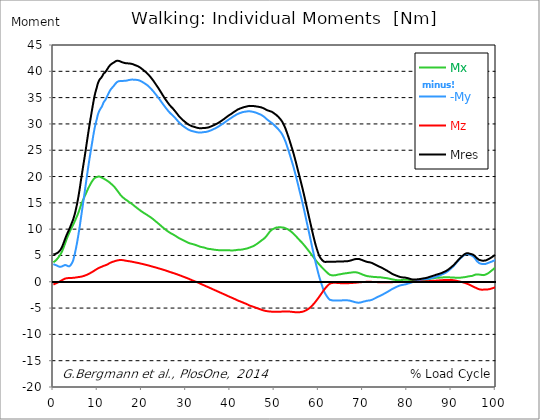
| Category |  Mx |  -My |  Mz |  Mres |
|---|---|---|---|---|
| 0.0 | 3.7 | 3.37 | -0.53 | 5.21 |
| 0.1646090534979424 | 3.8 | 3.3 | -0.46 | 5.23 |
| 0.3292181069958848 | 3.9 | 3.23 | -0.39 | 5.25 |
| 0.5041152263374485 | 4.02 | 3.19 | -0.33 | 5.3 |
| 0.668724279835391 | 4.16 | 3.13 | -0.27 | 5.37 |
| 0.8333333333333333 | 4.31 | 3.05 | -0.2 | 5.44 |
| 0.9979423868312757 | 4.47 | 2.98 | -0.13 | 5.53 |
| 1.162551440329218 | 4.66 | 2.91 | -0.06 | 5.64 |
| 1.337448559670782 | 4.85 | 2.87 | 0.01 | 5.78 |
| 1.5020576131687242 | 5.04 | 2.85 | 0.08 | 5.93 |
| 1.6666666666666665 | 5.28 | 2.86 | 0.17 | 6.15 |
| 1.831275720164609 | 5.55 | 2.91 | 0.25 | 6.41 |
| 1.9958847736625513 | 5.84 | 2.93 | 0.32 | 6.69 |
| 2.170781893004115 | 6.19 | 3.01 | 0.41 | 7.04 |
| 2.3353909465020575 | 6.55 | 3.09 | 0.48 | 7.41 |
| 2.4999999999999996 | 6.93 | 3.16 | 0.55 | 7.79 |
| 2.6646090534979425 | 7.32 | 3.19 | 0.61 | 8.17 |
| 2.829218106995885 | 7.71 | 3.18 | 0.65 | 8.54 |
| 3.0041152263374484 | 8.1 | 3.11 | 0.67 | 8.89 |
| 3.168724279835391 | 8.46 | 3.03 | 0.68 | 9.2 |
| 3.333333333333333 | 8.79 | 2.97 | 0.7 | 9.5 |
| 3.497942386831276 | 9.12 | 2.93 | 0.71 | 9.81 |
| 3.662551440329218 | 9.45 | 2.96 | 0.72 | 10.13 |
| 3.837448559670782 | 9.76 | 3.09 | 0.73 | 10.48 |
| 4.002057613168724 | 10.05 | 3.27 | 0.73 | 10.83 |
| 4.166666666666667 | 10.33 | 3.49 | 0.74 | 11.17 |
| 4.3312757201646095 | 10.6 | 3.76 | 0.74 | 11.52 |
| 4.495884773662552 | 10.87 | 4.12 | 0.74 | 11.9 |
| 4.670781893004115 | 11.18 | 4.68 | 0.76 | 12.38 |
| 4.835390946502058 | 11.48 | 5.24 | 0.78 | 12.85 |
| 4.999999999999999 | 11.8 | 5.9 | 0.8 | 13.42 |
| 5.164609053497943 | 12.13 | 6.59 | 0.82 | 14.04 |
| 5.329218106995885 | 12.45 | 7.31 | 0.85 | 14.69 |
| 5.504115226337448 | 12.8 | 8.12 | 0.87 | 15.42 |
| 5.668724279835391 | 13.15 | 8.95 | 0.89 | 16.19 |
| 5.833333333333333 | 13.55 | 9.83 | 0.91 | 17.03 |
| 5.997942386831276 | 13.95 | 10.73 | 0.93 | 17.91 |
| 6.162551440329218 | 14.38 | 11.73 | 0.95 | 18.89 |
| 6.337448559670782 | 14.76 | 12.7 | 0.98 | 19.8 |
| 6.502057613168724 | 15.12 | 13.66 | 1.01 | 20.7 |
| 6.666666666666666 | 15.46 | 14.62 | 1.05 | 21.6 |
| 6.831275720164609 | 15.79 | 15.58 | 1.1 | 22.47 |
| 6.995884773662552 | 16.1 | 16.53 | 1.14 | 23.35 |
| 7.170781893004115 | 16.41 | 17.55 | 1.2 | 24.25 |
| 7.3353909465020575 | 16.71 | 18.57 | 1.25 | 25.16 |
| 7.500000000000001 | 17.03 | 19.56 | 1.31 | 26.11 |
| 7.664609053497942 | 17.35 | 20.55 | 1.36 | 27.06 |
| 7.829218106995885 | 17.66 | 21.5 | 1.42 | 27.99 |
| 8.004115226337449 | 17.94 | 22.45 | 1.49 | 28.9 |
| 8.168724279835391 | 18.22 | 23.37 | 1.56 | 29.79 |
| 8.333333333333334 | 18.48 | 24.23 | 1.65 | 30.63 |
| 8.497942386831278 | 18.74 | 25.09 | 1.73 | 31.46 |
| 8.662551440329219 | 18.98 | 25.95 | 1.81 | 32.3 |
| 8.837448559670783 | 19.2 | 26.8 | 1.89 | 33.11 |
| 9.002057613168725 | 19.39 | 27.66 | 1.97 | 33.92 |
| 9.166666666666668 | 19.57 | 28.48 | 2.06 | 34.69 |
| 9.33127572016461 | 19.7 | 29.21 | 2.15 | 35.38 |
| 9.495884773662551 | 19.81 | 29.87 | 2.25 | 35.99 |
| 9.670781893004117 | 19.86 | 30.43 | 2.33 | 36.49 |
| 9.83539094650206 | 19.9 | 30.95 | 2.42 | 36.96 |
| 9.999999999999998 | 19.98 | 31.58 | 2.5 | 37.53 |
| 10.16460905349794 | 20.01 | 32.02 | 2.58 | 37.93 |
| 10.329218106995887 | 20.01 | 32.37 | 2.65 | 38.23 |
| 10.504115226337447 | 19.98 | 32.68 | 2.71 | 38.48 |
| 10.66872427983539 | 19.91 | 32.9 | 2.77 | 38.65 |
| 10.833333333333334 | 19.83 | 33.11 | 2.82 | 38.8 |
| 10.997942386831275 | 19.75 | 33.36 | 2.88 | 38.98 |
| 11.162551440329217 | 19.69 | 33.68 | 2.94 | 39.23 |
| 11.337448559670783 | 19.65 | 34.06 | 3.01 | 39.54 |
| 11.502057613168724 | 19.55 | 34.26 | 3.06 | 39.68 |
| 11.666666666666666 | 19.45 | 34.44 | 3.1 | 39.78 |
| 11.831275720164609 | 19.38 | 34.66 | 3.15 | 39.94 |
| 11.995884773662551 | 19.3 | 34.94 | 3.21 | 40.14 |
| 12.170781893004115 | 19.21 | 35.26 | 3.29 | 40.38 |
| 12.335390946502057 | 19.11 | 35.53 | 3.35 | 40.57 |
| 12.5 | 19.02 | 35.86 | 3.44 | 40.82 |
| 12.664609053497943 | 18.9 | 36.13 | 3.52 | 41 |
| 12.829218106995885 | 18.79 | 36.38 | 3.6 | 41.18 |
| 13.004115226337449 | 18.65 | 36.59 | 3.66 | 41.31 |
| 13.168724279835391 | 18.54 | 36.76 | 3.72 | 41.41 |
| 13.333333333333332 | 18.42 | 36.92 | 3.77 | 41.5 |
| 13.497942386831276 | 18.29 | 37.07 | 3.81 | 41.59 |
| 13.662551440329217 | 18.15 | 37.23 | 3.86 | 41.67 |
| 13.837448559670783 | 17.99 | 37.41 | 3.9 | 41.77 |
| 14.002057613168724 | 17.81 | 37.61 | 3.95 | 41.87 |
| 14.166666666666666 | 17.64 | 37.79 | 3.99 | 41.96 |
| 14.33127572016461 | 17.45 | 37.91 | 4.03 | 42 |
| 14.495884773662551 | 17.27 | 38.01 | 4.07 | 42.01 |
| 14.670781893004115 | 17.08 | 38.09 | 4.09 | 42.01 |
| 14.835390946502057 | 16.9 | 38.12 | 4.11 | 41.97 |
| 15.000000000000002 | 16.71 | 38.14 | 4.13 | 41.91 |
| 15.164609053497943 | 16.51 | 38.16 | 4.14 | 41.86 |
| 15.329218106995883 | 16.35 | 38.16 | 4.14 | 41.79 |
| 15.504115226337449 | 16.2 | 38.17 | 4.13 | 41.74 |
| 15.66872427983539 | 16.07 | 38.17 | 4.11 | 41.69 |
| 15.833333333333334 | 15.96 | 38.18 | 4.09 | 41.65 |
| 15.997942386831276 | 15.84 | 38.19 | 4.07 | 41.62 |
| 16.162551440329217 | 15.73 | 38.19 | 4.04 | 41.57 |
| 16.337448559670783 | 15.64 | 38.2 | 4.01 | 41.55 |
| 16.502057613168724 | 15.54 | 38.22 | 3.99 | 41.53 |
| 16.666666666666668 | 15.44 | 38.25 | 3.96 | 41.52 |
| 16.83127572016461 | 15.34 | 38.29 | 3.94 | 41.51 |
| 16.995884773662556 | 15.23 | 38.33 | 3.92 | 41.5 |
| 17.170781893004115 | 15.12 | 38.36 | 3.9 | 41.49 |
| 17.33539094650206 | 15.04 | 38.38 | 3.88 | 41.47 |
| 17.500000000000004 | 14.96 | 38.4 | 3.85 | 41.45 |
| 17.66460905349794 | 14.86 | 38.42 | 3.83 | 41.43 |
| 17.82921810699589 | 14.75 | 38.43 | 3.8 | 41.39 |
| 18.00411522633745 | 14.64 | 38.42 | 3.77 | 41.34 |
| 18.16872427983539 | 14.52 | 38.41 | 3.74 | 41.28 |
| 18.333333333333336 | 14.41 | 38.39 | 3.71 | 41.22 |
| 18.497942386831276 | 14.29 | 38.38 | 3.68 | 41.16 |
| 18.66255144032922 | 14.18 | 38.38 | 3.66 | 41.11 |
| 18.837448559670786 | 14.08 | 38.37 | 3.63 | 41.07 |
| 19.002057613168724 | 13.97 | 38.36 | 3.6 | 41.02 |
| 19.166666666666668 | 13.85 | 38.33 | 3.57 | 40.94 |
| 19.331275720164612 | 13.75 | 38.29 | 3.54 | 40.86 |
| 19.495884773662553 | 13.65 | 38.24 | 3.51 | 40.78 |
| 19.67078189300412 | 13.54 | 38.18 | 3.47 | 40.68 |
| 19.83539094650206 | 13.43 | 38.11 | 3.44 | 40.58 |
| 19.999999999999996 | 13.33 | 38.03 | 3.41 | 40.47 |
| 20.164609053497944 | 13.24 | 37.95 | 3.37 | 40.36 |
| 20.32921810699588 | 13.14 | 37.87 | 3.34 | 40.25 |
| 20.504115226337447 | 13.06 | 37.77 | 3.3 | 40.12 |
| 20.66872427983539 | 12.97 | 37.68 | 3.27 | 40.01 |
| 20.833333333333332 | 12.89 | 37.59 | 3.24 | 39.9 |
| 20.997942386831276 | 12.8 | 37.51 | 3.21 | 39.79 |
| 21.162551440329217 | 12.71 | 37.4 | 3.17 | 39.65 |
| 21.33744855967078 | 12.62 | 37.29 | 3.13 | 39.51 |
| 21.502057613168724 | 12.52 | 37.17 | 3.1 | 39.37 |
| 21.666666666666668 | 12.43 | 37.04 | 3.06 | 39.21 |
| 21.83127572016461 | 12.34 | 36.89 | 3.02 | 39.04 |
| 21.99588477366255 | 12.25 | 36.74 | 2.98 | 38.87 |
| 22.170781893004115 | 12.15 | 36.6 | 2.94 | 38.7 |
| 22.335390946502056 | 12.05 | 36.45 | 2.9 | 38.52 |
| 22.5 | 11.94 | 36.3 | 2.86 | 38.34 |
| 22.664609053497944 | 11.82 | 36.13 | 2.82 | 38.14 |
| 22.82921810699588 | 11.7 | 35.96 | 2.79 | 37.94 |
| 23.004115226337447 | 11.58 | 35.77 | 2.75 | 37.73 |
| 23.16872427983539 | 11.46 | 35.6 | 2.71 | 37.52 |
| 23.333333333333332 | 11.34 | 35.42 | 2.67 | 37.31 |
| 23.497942386831276 | 11.24 | 35.25 | 2.62 | 37.12 |
| 23.662551440329217 | 11.12 | 35.07 | 2.58 | 36.9 |
| 23.83744855967078 | 11 | 34.88 | 2.54 | 36.69 |
| 24.002057613168727 | 10.88 | 34.69 | 2.5 | 36.46 |
| 24.166666666666664 | 10.76 | 34.49 | 2.46 | 36.24 |
| 24.33127572016461 | 10.63 | 34.3 | 2.42 | 36.01 |
| 24.495884773662553 | 10.51 | 34.1 | 2.38 | 35.79 |
| 24.670781893004115 | 10.39 | 33.9 | 2.33 | 35.56 |
| 24.83539094650206 | 10.27 | 33.7 | 2.29 | 35.33 |
| 25.0 | 10.15 | 33.51 | 2.25 | 35.11 |
| 25.164609053497944 | 10.04 | 33.33 | 2.2 | 34.9 |
| 25.329218106995885 | 9.93 | 33.14 | 2.16 | 34.69 |
| 25.504115226337447 | 9.82 | 32.96 | 2.11 | 34.48 |
| 25.66872427983539 | 9.71 | 32.78 | 2.06 | 34.28 |
| 25.833333333333332 | 9.61 | 32.61 | 2.01 | 34.09 |
| 25.997942386831276 | 9.51 | 32.45 | 1.97 | 33.9 |
| 26.16255144032922 | 9.42 | 32.28 | 1.92 | 33.71 |
| 26.337448559670783 | 9.33 | 32.12 | 1.87 | 33.53 |
| 26.502057613168724 | 9.25 | 31.99 | 1.83 | 33.38 |
| 26.666666666666664 | 9.17 | 31.86 | 1.78 | 33.23 |
| 26.83127572016461 | 9.1 | 31.73 | 1.74 | 33.09 |
| 26.995884773662553 | 9.02 | 31.61 | 1.69 | 32.95 |
| 27.170781893004115 | 8.94 | 31.46 | 1.64 | 32.78 |
| 27.33539094650206 | 8.86 | 31.31 | 1.6 | 32.61 |
| 27.499999999999996 | 8.78 | 31.17 | 1.55 | 32.45 |
| 27.66460905349794 | 8.69 | 31.01 | 1.5 | 32.27 |
| 27.829218106995885 | 8.6 | 30.85 | 1.46 | 32.09 |
| 28.004115226337447 | 8.51 | 30.69 | 1.41 | 31.91 |
| 28.16872427983539 | 8.42 | 30.52 | 1.35 | 31.72 |
| 28.333333333333332 | 8.33 | 30.36 | 1.3 | 31.54 |
| 28.49794238683128 | 8.25 | 30.22 | 1.25 | 31.38 |
| 28.66255144032922 | 8.18 | 30.08 | 1.2 | 31.23 |
| 28.837448559670783 | 8.11 | 29.95 | 1.14 | 31.09 |
| 29.002057613168724 | 8.04 | 29.83 | 1.09 | 30.95 |
| 29.166666666666664 | 7.98 | 29.71 | 1.04 | 30.82 |
| 29.331275720164612 | 7.91 | 29.61 | 0.98 | 30.69 |
| 29.495884773662553 | 7.84 | 29.5 | 0.93 | 30.57 |
| 29.670781893004115 | 7.77 | 29.4 | 0.88 | 30.45 |
| 29.835390946502056 | 7.7 | 29.3 | 0.83 | 30.34 |
| 30.000000000000004 | 7.63 | 29.2 | 0.77 | 30.23 |
| 30.164609053497944 | 7.55 | 29.11 | 0.72 | 30.12 |
| 30.329218106995885 | 7.48 | 29.02 | 0.66 | 30.01 |
| 30.504115226337447 | 7.41 | 28.94 | 0.61 | 29.91 |
| 30.66872427983539 | 7.36 | 28.87 | 0.55 | 29.83 |
| 30.833333333333336 | 7.31 | 28.8 | 0.48 | 29.76 |
| 30.99794238683128 | 7.27 | 28.74 | 0.42 | 29.69 |
| 31.162551440329217 | 7.23 | 28.69 | 0.36 | 29.63 |
| 31.33744855967078 | 7.19 | 28.64 | 0.3 | 29.57 |
| 31.50205761316873 | 7.16 | 28.61 | 0.24 | 29.53 |
| 31.666666666666668 | 7.12 | 28.58 | 0.18 | 29.49 |
| 31.831275720164612 | 7.08 | 28.55 | 0.13 | 29.45 |
| 31.995884773662553 | 7.04 | 28.51 | 0.07 | 29.4 |
| 32.17078189300411 | 6.99 | 28.48 | 0.02 | 29.36 |
| 32.33539094650206 | 6.94 | 28.44 | -0.02 | 29.31 |
| 32.5 | 6.89 | 28.41 | -0.08 | 29.27 |
| 32.66460905349794 | 6.83 | 28.39 | -0.14 | 29.24 |
| 32.82921810699589 | 6.78 | 28.37 | -0.2 | 29.21 |
| 33.00411522633745 | 6.72 | 28.36 | -0.26 | 29.19 |
| 33.168724279835395 | 6.67 | 28.35 | -0.33 | 29.16 |
| 33.333333333333336 | 6.64 | 28.34 | -0.4 | 29.16 |
| 33.49794238683128 | 6.6 | 28.36 | -0.46 | 29.17 |
| 33.66255144032922 | 6.58 | 28.4 | -0.53 | 29.2 |
| 33.83744855967078 | 6.55 | 28.43 | -0.59 | 29.22 |
| 34.00205761316873 | 6.51 | 28.44 | -0.65 | 29.23 |
| 34.16666666666667 | 6.48 | 28.45 | -0.72 | 29.23 |
| 34.331275720164605 | 6.43 | 28.46 | -0.78 | 29.24 |
| 34.49588477366255 | 6.39 | 28.48 | -0.84 | 29.24 |
| 34.67078189300412 | 6.33 | 28.52 | -0.9 | 29.27 |
| 34.83539094650206 | 6.29 | 28.55 | -0.95 | 29.3 |
| 35.00000000000001 | 6.26 | 28.58 | -1.02 | 29.32 |
| 35.16460905349794 | 6.24 | 28.63 | -1.08 | 29.37 |
| 35.32921810699588 | 6.23 | 28.68 | -1.15 | 29.42 |
| 35.504115226337454 | 6.22 | 28.74 | -1.21 | 29.47 |
| 35.668724279835395 | 6.19 | 28.79 | -1.27 | 29.53 |
| 35.833333333333336 | 6.17 | 28.85 | -1.33 | 29.58 |
| 35.99794238683128 | 6.15 | 28.92 | -1.4 | 29.65 |
| 36.16255144032922 | 6.13 | 28.99 | -1.47 | 29.71 |
| 36.33744855967078 | 6.11 | 29.05 | -1.53 | 29.77 |
| 36.50205761316873 | 6.08 | 29.12 | -1.59 | 29.84 |
| 36.66666666666667 | 6.06 | 29.19 | -1.65 | 29.91 |
| 36.831275720164605 | 6.05 | 29.26 | -1.71 | 29.98 |
| 36.99588477366255 | 6.03 | 29.33 | -1.78 | 30.05 |
| 37.17078189300412 | 6.02 | 29.42 | -1.84 | 30.13 |
| 37.33539094650206 | 6.01 | 29.5 | -1.9 | 30.22 |
| 37.5 | 6 | 29.59 | -1.97 | 30.31 |
| 37.66460905349794 | 5.98 | 29.68 | -2.03 | 30.4 |
| 37.82921810699589 | 5.97 | 29.78 | -2.09 | 30.5 |
| 38.00411522633745 | 5.96 | 29.87 | -2.15 | 30.59 |
| 38.168724279835395 | 5.97 | 29.96 | -2.22 | 30.68 |
| 38.333333333333336 | 5.97 | 30.05 | -2.28 | 30.78 |
| 38.49794238683127 | 5.97 | 30.15 | -2.34 | 30.88 |
| 38.662551440329224 | 5.97 | 30.25 | -2.4 | 30.98 |
| 38.83744855967078 | 5.97 | 30.35 | -2.47 | 31.09 |
| 39.00205761316872 | 5.97 | 30.45 | -2.53 | 31.2 |
| 39.16666666666667 | 5.98 | 30.55 | -2.59 | 31.3 |
| 39.331275720164605 | 5.98 | 30.65 | -2.66 | 31.41 |
| 39.49588477366255 | 5.98 | 30.75 | -2.73 | 31.51 |
| 39.67078189300412 | 5.98 | 30.85 | -2.79 | 31.62 |
| 39.83539094650206 | 5.98 | 30.94 | -2.86 | 31.71 |
| 39.99999999999999 | 5.96 | 31.02 | -2.91 | 31.79 |
| 40.16460905349794 | 5.95 | 31.11 | -2.97 | 31.87 |
| 40.32921810699589 | 5.95 | 31.2 | -3.03 | 31.97 |
| 40.50411522633745 | 5.96 | 31.3 | -3.09 | 32.07 |
| 40.668724279835395 | 5.96 | 31.4 | -3.15 | 32.18 |
| 40.83333333333333 | 5.97 | 31.49 | -3.22 | 32.28 |
| 40.99794238683128 | 5.99 | 31.57 | -3.28 | 32.36 |
| 41.16255144032922 | 6 | 31.65 | -3.35 | 32.45 |
| 41.33744855967078 | 6.02 | 31.73 | -3.42 | 32.54 |
| 41.50205761316872 | 6.04 | 31.82 | -3.49 | 32.64 |
| 41.666666666666664 | 6.06 | 31.89 | -3.55 | 32.73 |
| 41.83127572016461 | 6.09 | 31.95 | -3.6 | 32.79 |
| 41.99588477366255 | 6.11 | 32 | -3.66 | 32.85 |
| 42.17078189300412 | 6.1 | 32.06 | -3.71 | 32.92 |
| 42.33539094650206 | 6.1 | 32.12 | -3.76 | 32.97 |
| 42.5 | 6.11 | 32.15 | -3.82 | 33.02 |
| 42.66460905349794 | 6.12 | 32.19 | -3.88 | 33.06 |
| 42.82921810699589 | 6.15 | 32.25 | -3.93 | 33.12 |
| 43.00411522633745 | 6.19 | 32.27 | -3.99 | 33.17 |
| 43.16872427983539 | 6.23 | 32.3 | -4.05 | 33.2 |
| 43.333333333333336 | 6.25 | 32.32 | -4.11 | 33.24 |
| 43.49794238683128 | 6.27 | 32.34 | -4.16 | 33.27 |
| 43.66255144032922 | 6.3 | 32.36 | -4.22 | 33.3 |
| 43.83744855967078 | 6.34 | 32.38 | -4.28 | 33.33 |
| 44.00205761316873 | 6.39 | 32.4 | -4.35 | 33.37 |
| 44.166666666666664 | 6.44 | 32.42 | -4.43 | 33.41 |
| 44.33127572016461 | 6.49 | 32.42 | -4.5 | 33.43 |
| 44.49588477366255 | 6.54 | 32.39 | -4.55 | 33.42 |
| 44.67078189300411 | 6.59 | 32.36 | -4.6 | 33.41 |
| 44.835390946502066 | 6.65 | 32.35 | -4.64 | 33.41 |
| 45.0 | 6.7 | 32.32 | -4.69 | 33.4 |
| 45.16460905349794 | 6.76 | 32.29 | -4.74 | 33.4 |
| 45.32921810699589 | 6.83 | 32.26 | -4.79 | 33.39 |
| 45.504115226337454 | 6.91 | 32.22 | -4.84 | 33.37 |
| 45.668724279835395 | 7 | 32.17 | -4.89 | 33.35 |
| 45.83333333333333 | 7.09 | 32.13 | -4.95 | 33.33 |
| 45.99794238683128 | 7.18 | 32.08 | -5 | 33.31 |
| 46.16255144032922 | 7.28 | 32.02 | -5.05 | 33.29 |
| 46.33744855967078 | 7.38 | 31.97 | -5.1 | 33.26 |
| 46.50205761316873 | 7.49 | 31.9 | -5.15 | 33.23 |
| 46.666666666666664 | 7.6 | 31.84 | -5.2 | 33.21 |
| 46.831275720164605 | 7.69 | 31.79 | -5.25 | 33.18 |
| 46.99588477366255 | 7.8 | 31.72 | -5.3 | 33.15 |
| 47.17078189300412 | 7.93 | 31.63 | -5.34 | 33.1 |
| 47.33539094650206 | 8.02 | 31.54 | -5.39 | 33.04 |
| 47.5 | 8.11 | 31.45 | -5.43 | 32.98 |
| 47.66460905349794 | 8.23 | 31.34 | -5.48 | 32.91 |
| 47.82921810699588 | 8.36 | 31.22 | -5.52 | 32.84 |
| 48.004115226337454 | 8.51 | 31.1 | -5.55 | 32.76 |
| 48.168724279835395 | 8.68 | 30.96 | -5.57 | 32.67 |
| 48.33333333333333 | 8.86 | 30.83 | -5.59 | 32.6 |
| 48.49794238683128 | 9.04 | 30.73 | -5.61 | 32.56 |
| 48.66255144032922 | 9.23 | 30.63 | -5.63 | 32.52 |
| 48.83744855967078 | 9.41 | 30.52 | -5.65 | 32.47 |
| 49.00205761316873 | 9.57 | 30.41 | -5.66 | 32.42 |
| 49.166666666666664 | 9.73 | 30.31 | -5.67 | 32.37 |
| 49.331275720164605 | 9.86 | 30.22 | -5.68 | 32.33 |
| 49.49588477366255 | 9.96 | 30.11 | -5.69 | 32.26 |
| 49.67078189300412 | 10.03 | 29.99 | -5.7 | 32.17 |
| 49.83539094650206 | 10.08 | 29.86 | -5.7 | 32.06 |
| 50.0 | 10.15 | 29.71 | -5.7 | 31.95 |
| 50.16460905349794 | 10.23 | 29.58 | -5.71 | 31.86 |
| 50.32921810699589 | 10.29 | 29.45 | -5.72 | 31.76 |
| 50.504115226337454 | 10.32 | 29.31 | -5.72 | 31.63 |
| 50.668724279835395 | 10.33 | 29.17 | -5.71 | 31.5 |
| 50.83333333333333 | 10.34 | 29.02 | -5.71 | 31.37 |
| 50.99794238683128 | 10.34 | 28.86 | -5.7 | 31.22 |
| 51.162551440329224 | 10.35 | 28.68 | -5.7 | 31.06 |
| 51.33744855967078 | 10.35 | 28.51 | -5.69 | 30.9 |
| 51.50205761316873 | 10.34 | 28.33 | -5.68 | 30.73 |
| 51.666666666666664 | 10.34 | 28.11 | -5.67 | 30.53 |
| 51.83127572016461 | 10.33 | 27.86 | -5.66 | 30.29 |
| 51.99588477366255 | 10.3 | 27.58 | -5.65 | 30.02 |
| 52.17078189300412 | 10.27 | 27.28 | -5.65 | 29.73 |
| 52.335390946502066 | 10.22 | 26.96 | -5.64 | 29.43 |
| 52.5 | 10.17 | 26.61 | -5.64 | 29.08 |
| 52.66460905349795 | 10.11 | 26.21 | -5.64 | 28.7 |
| 52.82921810699588 | 10.04 | 25.8 | -5.65 | 28.31 |
| 53.00411522633745 | 9.98 | 25.38 | -5.65 | 27.9 |
| 53.1687242798354 | 9.9 | 24.95 | -5.66 | 27.49 |
| 53.33333333333333 | 9.81 | 24.51 | -5.66 | 27.06 |
| 53.49794238683128 | 9.71 | 24.05 | -5.68 | 26.61 |
| 53.66255144032922 | 9.6 | 23.59 | -5.69 | 26.16 |
| 53.83744855967078 | 9.48 | 23.12 | -5.71 | 25.7 |
| 54.00205761316873 | 9.37 | 22.67 | -5.72 | 25.25 |
| 54.166666666666664 | 9.24 | 22.19 | -5.74 | 24.78 |
| 54.33127572016461 | 9.11 | 21.7 | -5.75 | 24.3 |
| 54.495884773662546 | 8.96 | 21.18 | -5.76 | 23.79 |
| 54.67078189300412 | 8.82 | 20.65 | -5.78 | 23.26 |
| 54.835390946502066 | 8.67 | 20.11 | -5.79 | 22.74 |
| 54.99999999999999 | 8.52 | 19.56 | -5.79 | 22.19 |
| 55.16460905349795 | 8.37 | 18.99 | -5.8 | 21.64 |
| 55.32921810699588 | 8.21 | 18.43 | -5.8 | 21.08 |
| 55.50411522633745 | 8.06 | 17.86 | -5.79 | 20.53 |
| 55.668724279835395 | 7.91 | 17.29 | -5.78 | 19.98 |
| 55.83333333333333 | 7.76 | 16.72 | -5.76 | 19.42 |
| 55.99794238683128 | 7.63 | 16.16 | -5.75 | 18.88 |
| 56.162551440329224 | 7.48 | 15.57 | -5.72 | 18.32 |
| 56.33744855967078 | 7.32 | 14.97 | -5.69 | 17.74 |
| 56.50205761316873 | 7.16 | 14.37 | -5.65 | 17.15 |
| 56.666666666666664 | 7 | 13.76 | -5.61 | 16.56 |
| 56.83127572016461 | 6.83 | 13.13 | -5.55 | 15.95 |
| 56.99588477366256 | 6.66 | 12.48 | -5.48 | 15.32 |
| 57.17078189300412 | 6.48 | 11.83 | -5.41 | 14.69 |
| 57.335390946502066 | 6.3 | 11.19 | -5.33 | 14.07 |
| 57.49999999999999 | 6.12 | 10.54 | -5.25 | 13.44 |
| 57.66460905349794 | 5.94 | 9.89 | -5.16 | 12.81 |
| 57.829218106995896 | 5.76 | 9.25 | -5.06 | 12.19 |
| 58.00411522633745 | 5.58 | 8.6 | -4.94 | 11.58 |
| 58.168724279835395 | 5.39 | 7.96 | -4.81 | 10.97 |
| 58.33333333333333 | 5.2 | 7.31 | -4.68 | 10.35 |
| 58.49794238683128 | 5.02 | 6.66 | -4.53 | 9.74 |
| 58.662551440329224 | 4.83 | 6.02 | -4.39 | 9.13 |
| 58.83744855967078 | 4.64 | 5.38 | -4.24 | 8.53 |
| 59.00205761316873 | 4.46 | 4.74 | -4.08 | 7.96 |
| 59.16666666666666 | 4.27 | 4.12 | -3.9 | 7.41 |
| 59.33127572016461 | 4.08 | 3.53 | -3.73 | 6.9 |
| 59.49588477366256 | 3.9 | 2.96 | -3.54 | 6.43 |
| 59.67078189300411 | 3.73 | 2.4 | -3.36 | 5.98 |
| 59.835390946502066 | 3.56 | 1.85 | -3.17 | 5.56 |
| 60.00000000000001 | 3.4 | 1.31 | -2.98 | 5.17 |
| 60.16460905349794 | 3.24 | 0.81 | -2.79 | 4.83 |
| 60.32921810699589 | 3.09 | 0.35 | -2.59 | 4.6 |
| 60.50411522633745 | 2.94 | -0.1 | -2.38 | 4.4 |
| 60.66872427983539 | 2.79 | -0.53 | -2.18 | 4.23 |
| 60.833333333333336 | 2.64 | -0.95 | -1.97 | 4.07 |
| 60.99794238683128 | 2.5 | -1.35 | -1.77 | 3.93 |
| 61.162551440329224 | 2.36 | -1.72 | -1.58 | 3.83 |
| 61.33744855967078 | 2.22 | -2.04 | -1.39 | 3.78 |
| 61.50205761316872 | 2.08 | -2.3 | -1.21 | 3.77 |
| 61.66666666666667 | 1.95 | -2.53 | -1.05 | 3.78 |
| 61.831275720164605 | 1.81 | -2.73 | -0.9 | 3.79 |
| 61.99588477366256 | 1.68 | -2.94 | -0.75 | 3.79 |
| 62.17078189300411 | 1.54 | -3.14 | -0.61 | 3.79 |
| 62.33539094650205 | 1.43 | -3.29 | -0.48 | 3.79 |
| 62.50000000000001 | 1.34 | -3.41 | -0.37 | 3.81 |
| 62.66460905349794 | 1.3 | -3.44 | -0.31 | 3.8 |
| 62.82921810699589 | 1.26 | -3.49 | -0.27 | 3.81 |
| 63.00411522633746 | 1.23 | -3.53 | -0.23 | 3.82 |
| 63.16872427983539 | 1.21 | -3.55 | -0.21 | 3.82 |
| 63.333333333333336 | 1.21 | -3.57 | -0.2 | 3.82 |
| 63.49794238683128 | 1.22 | -3.56 | -0.2 | 3.81 |
| 63.662551440329224 | 1.23 | -3.56 | -0.19 | 3.81 |
| 63.83744855967079 | 1.25 | -3.56 | -0.19 | 3.82 |
| 64.00205761316873 | 1.29 | -3.56 | -0.21 | 3.83 |
| 64.16666666666667 | 1.33 | -3.56 | -0.22 | 3.84 |
| 64.3312757201646 | 1.37 | -3.56 | -0.24 | 3.85 |
| 64.49588477366255 | 1.39 | -3.55 | -0.25 | 3.85 |
| 64.67078189300412 | 1.41 | -3.54 | -0.25 | 3.85 |
| 64.83539094650206 | 1.42 | -3.54 | -0.26 | 3.85 |
| 65.0 | 1.45 | -3.54 | -0.27 | 3.85 |
| 65.16460905349794 | 1.48 | -3.54 | -0.28 | 3.86 |
| 65.32921810699588 | 1.51 | -3.53 | -0.29 | 3.87 |
| 65.50411522633745 | 1.54 | -3.53 | -0.29 | 3.87 |
| 65.66872427983539 | 1.56 | -3.53 | -0.29 | 3.88 |
| 65.83333333333334 | 1.58 | -3.52 | -0.29 | 3.88 |
| 65.99794238683127 | 1.61 | -3.52 | -0.29 | 3.89 |
| 66.16255144032922 | 1.62 | -3.52 | -0.29 | 3.9 |
| 66.33744855967079 | 1.64 | -3.53 | -0.29 | 3.91 |
| 66.50205761316873 | 1.65 | -3.53 | -0.28 | 3.91 |
| 66.66666666666667 | 1.67 | -3.54 | -0.27 | 3.93 |
| 66.8312757201646 | 1.7 | -3.56 | -0.27 | 3.96 |
| 66.99588477366255 | 1.71 | -3.59 | -0.25 | 3.99 |
| 67.17078189300412 | 1.73 | -3.62 | -0.24 | 4.03 |
| 67.33539094650206 | 1.75 | -3.66 | -0.23 | 4.07 |
| 67.5 | 1.77 | -3.7 | -0.22 | 4.12 |
| 67.66460905349794 | 1.79 | -3.74 | -0.22 | 4.16 |
| 67.8292181069959 | 1.81 | -3.78 | -0.21 | 4.21 |
| 68.00411522633746 | 1.82 | -3.82 | -0.2 | 4.25 |
| 68.16872427983539 | 1.82 | -3.87 | -0.19 | 4.29 |
| 68.33333333333334 | 1.81 | -3.89 | -0.18 | 4.31 |
| 68.49794238683127 | 1.79 | -3.92 | -0.16 | 4.33 |
| 68.66255144032921 | 1.76 | -3.96 | -0.15 | 4.35 |
| 68.83744855967078 | 1.73 | -3.97 | -0.14 | 4.35 |
| 69.00205761316872 | 1.68 | -3.98 | -0.12 | 4.34 |
| 69.16666666666667 | 1.63 | -3.97 | -0.11 | 4.32 |
| 69.33127572016461 | 1.58 | -3.95 | -0.09 | 4.27 |
| 69.49588477366255 | 1.52 | -3.92 | -0.08 | 4.22 |
| 69.67078189300412 | 1.46 | -3.89 | -0.07 | 4.17 |
| 69.83539094650206 | 1.4 | -3.85 | -0.07 | 4.12 |
| 70.00000000000001 | 1.34 | -3.8 | -0.06 | 4.05 |
| 70.16460905349794 | 1.29 | -3.76 | -0.05 | 4 |
| 70.32921810699588 | 1.23 | -3.74 | -0.04 | 3.95 |
| 70.50411522633745 | 1.19 | -3.7 | -0.03 | 3.9 |
| 70.66872427983539 | 1.14 | -3.66 | -0.02 | 3.85 |
| 70.83333333333333 | 1.1 | -3.62 | -0.02 | 3.8 |
| 70.99794238683128 | 1.07 | -3.6 | -0.01 | 3.77 |
| 71.16255144032922 | 1.05 | -3.58 | -0.01 | 3.74 |
| 71.33744855967079 | 1.03 | -3.57 | 0 | 3.72 |
| 71.50205761316873 | 1.01 | -3.55 | 0 | 3.7 |
| 71.66666666666667 | 1 | -3.51 | -0.01 | 3.66 |
| 71.83127572016461 | 0.98 | -3.48 | -0.01 | 3.63 |
| 71.99588477366255 | 0.96 | -3.44 | -0.02 | 3.58 |
| 72.17078189300412 | 0.94 | -3.38 | -0.02 | 3.52 |
| 72.33539094650205 | 0.93 | -3.31 | -0.03 | 3.45 |
| 72.5 | 0.92 | -3.24 | -0.04 | 3.38 |
| 72.66460905349795 | 0.91 | -3.18 | -0.04 | 3.31 |
| 72.82921810699588 | 0.9 | -3.1 | -0.05 | 3.24 |
| 73.00411522633746 | 0.89 | -3.02 | -0.06 | 3.16 |
| 73.1687242798354 | 0.88 | -2.95 | -0.06 | 3.09 |
| 73.33333333333334 | 0.88 | -2.88 | -0.07 | 3.02 |
| 73.49794238683127 | 0.88 | -2.81 | -0.07 | 2.95 |
| 73.66255144032921 | 0.87 | -2.75 | -0.08 | 2.89 |
| 73.83744855967078 | 0.86 | -2.69 | -0.08 | 2.83 |
| 74.00205761316873 | 0.85 | -2.62 | -0.08 | 2.77 |
| 74.16666666666667 | 0.83 | -2.55 | -0.08 | 2.7 |
| 74.33127572016461 | 0.81 | -2.48 | -0.09 | 2.62 |
| 74.49588477366255 | 0.78 | -2.41 | -0.09 | 2.55 |
| 74.67078189300412 | 0.76 | -2.33 | -0.09 | 2.47 |
| 74.83539094650207 | 0.74 | -2.25 | -0.09 | 2.39 |
| 75.0 | 0.72 | -2.17 | -0.09 | 2.31 |
| 75.16460905349794 | 0.71 | -2.1 | -0.09 | 2.24 |
| 75.32921810699588 | 0.69 | -2.02 | -0.09 | 2.16 |
| 75.50411522633745 | 0.67 | -1.94 | -0.09 | 2.08 |
| 75.6687242798354 | 0.64 | -1.85 | -0.09 | 1.99 |
| 75.83333333333333 | 0.61 | -1.77 | -0.09 | 1.9 |
| 75.99794238683128 | 0.58 | -1.69 | -0.08 | 1.82 |
| 76.16255144032922 | 0.55 | -1.61 | -0.08 | 1.74 |
| 76.33744855967079 | 0.52 | -1.52 | -0.08 | 1.65 |
| 76.50205761316873 | 0.48 | -1.43 | -0.07 | 1.56 |
| 76.66666666666667 | 0.45 | -1.35 | -0.07 | 1.48 |
| 76.83127572016461 | 0.42 | -1.28 | -0.07 | 1.41 |
| 76.99588477366254 | 0.4 | -1.21 | -0.06 | 1.35 |
| 77.17078189300412 | 0.37 | -1.14 | -0.06 | 1.3 |
| 77.33539094650206 | 0.35 | -1.07 | -0.06 | 1.24 |
| 77.5 | 0.33 | -1.01 | -0.05 | 1.19 |
| 77.66460905349794 | 0.31 | -0.95 | -0.05 | 1.14 |
| 77.82921810699588 | 0.29 | -0.88 | -0.05 | 1.08 |
| 78.00411522633745 | 0.29 | -0.82 | -0.06 | 1.02 |
| 78.1687242798354 | 0.29 | -0.77 | -0.06 | 0.97 |
| 78.33333333333334 | 0.29 | -0.72 | -0.06 | 0.93 |
| 78.49794238683127 | 0.3 | -0.68 | -0.06 | 0.89 |
| 78.66255144032921 | 0.32 | -0.64 | -0.06 | 0.86 |
| 78.83744855967078 | 0.34 | -0.61 | -0.05 | 0.84 |
| 79.00205761316873 | 0.36 | -0.58 | -0.05 | 0.83 |
| 79.16666666666667 | 0.37 | -0.56 | -0.05 | 0.82 |
| 79.33127572016461 | 0.38 | -0.54 | -0.05 | 0.81 |
| 79.49588477366257 | 0.38 | -0.51 | -0.04 | 0.8 |
| 79.67078189300412 | 0.39 | -0.48 | -0.04 | 0.78 |
| 79.83539094650207 | 0.39 | -0.44 | -0.04 | 0.74 |
| 79.99999999999999 | 0.39 | -0.39 | -0.03 | 0.71 |
| 80.16460905349794 | 0.38 | -0.35 | -0.03 | 0.68 |
| 80.32921810699588 | 0.36 | -0.31 | -0.03 | 0.63 |
| 80.50411522633745 | 0.33 | -0.27 | -0.02 | 0.59 |
| 80.66872427983539 | 0.3 | -0.22 | -0.02 | 0.54 |
| 80.83333333333333 | 0.27 | -0.18 | -0.01 | 0.5 |
| 80.99794238683128 | 0.24 | -0.14 | -0.01 | 0.47 |
| 81.16255144032922 | 0.21 | -0.09 | -0.01 | 0.45 |
| 81.33744855967079 | 0.18 | -0.04 | 0 | 0.44 |
| 81.50205761316873 | 0.15 | 0.01 | 0 | 0.43 |
| 81.66666666666666 | 0.11 | 0.05 | 0 | 0.43 |
| 81.83127572016461 | 0.09 | 0.09 | 0 | 0.42 |
| 81.99588477366255 | 0.06 | 0.13 | 0.01 | 0.44 |
| 82.1707818930041 | 0.05 | 0.16 | 0.01 | 0.45 |
| 82.33539094650206 | 0.05 | 0.18 | 0.01 | 0.46 |
| 82.5 | 0.06 | 0.21 | 0.01 | 0.47 |
| 82.66460905349794 | 0.06 | 0.25 | 0.01 | 0.48 |
| 82.8292181069959 | 0.07 | 0.28 | 0.02 | 0.51 |
| 83.00411522633745 | 0.09 | 0.31 | 0.03 | 0.53 |
| 83.1687242798354 | 0.11 | 0.34 | 0.03 | 0.56 |
| 83.33333333333333 | 0.13 | 0.37 | 0.04 | 0.59 |
| 83.49794238683127 | 0.15 | 0.4 | 0.05 | 0.61 |
| 83.66255144032922 | 0.18 | 0.43 | 0.05 | 0.63 |
| 83.83744855967078 | 0.21 | 0.45 | 0.06 | 0.66 |
| 84.00205761316873 | 0.25 | 0.47 | 0.07 | 0.68 |
| 84.16666666666667 | 0.28 | 0.49 | 0.08 | 0.7 |
| 84.33127572016461 | 0.32 | 0.5 | 0.08 | 0.73 |
| 84.49588477366257 | 0.36 | 0.53 | 0.1 | 0.77 |
| 84.67078189300412 | 0.41 | 0.55 | 0.11 | 0.8 |
| 84.83539094650206 | 0.46 | 0.58 | 0.12 | 0.86 |
| 85.0 | 0.5 | 0.6 | 0.13 | 0.9 |
| 85.16460905349794 | 0.54 | 0.63 | 0.14 | 0.95 |
| 85.32921810699588 | 0.58 | 0.66 | 0.15 | 0.99 |
| 85.50411522633745 | 0.61 | 0.7 | 0.16 | 1.04 |
| 85.66872427983539 | 0.63 | 0.74 | 0.17 | 1.08 |
| 85.83333333333334 | 0.66 | 0.78 | 0.18 | 1.12 |
| 85.99794238683128 | 0.69 | 0.82 | 0.19 | 1.17 |
| 86.16255144032922 | 0.71 | 0.87 | 0.2 | 1.22 |
| 86.33744855967078 | 0.73 | 0.92 | 0.2 | 1.27 |
| 86.50205761316873 | 0.75 | 0.96 | 0.21 | 1.32 |
| 86.66666666666667 | 0.77 | 1 | 0.23 | 1.36 |
| 86.8312757201646 | 0.79 | 1.04 | 0.24 | 1.4 |
| 86.99588477366255 | 0.79 | 1.09 | 0.25 | 1.45 |
| 87.17078189300412 | 0.78 | 1.14 | 0.26 | 1.49 |
| 87.33539094650206 | 0.79 | 1.2 | 0.27 | 1.53 |
| 87.5 | 0.8 | 1.26 | 0.28 | 1.57 |
| 87.66460905349794 | 0.8 | 1.32 | 0.29 | 1.62 |
| 87.8292181069959 | 0.81 | 1.38 | 0.3 | 1.68 |
| 88.00411522633746 | 0.83 | 1.44 | 0.31 | 1.74 |
| 88.1687242798354 | 0.84 | 1.51 | 0.32 | 1.81 |
| 88.33333333333333 | 0.84 | 1.58 | 0.33 | 1.87 |
| 88.49794238683127 | 0.85 | 1.64 | 0.33 | 1.93 |
| 88.66255144032922 | 0.85 | 1.72 | 0.34 | 2 |
| 88.83744855967079 | 0.86 | 1.79 | 0.35 | 2.07 |
| 89.00205761316872 | 0.86 | 1.89 | 0.35 | 2.16 |
| 89.16666666666667 | 0.85 | 1.98 | 0.35 | 2.24 |
| 89.33127572016461 | 0.85 | 2.09 | 0.35 | 2.35 |
| 89.49588477366255 | 0.84 | 2.22 | 0.34 | 2.46 |
| 89.67078189300413 | 0.84 | 2.33 | 0.34 | 2.57 |
| 89.83539094650206 | 0.83 | 2.46 | 0.34 | 2.68 |
| 90.0 | 0.82 | 2.59 | 0.33 | 2.81 |
| 90.16460905349794 | 0.81 | 2.72 | 0.32 | 2.92 |
| 90.32921810699588 | 0.81 | 2.85 | 0.31 | 3.03 |
| 90.50411522633745 | 0.81 | 2.98 | 0.29 | 3.16 |
| 90.66872427983539 | 0.8 | 3.13 | 0.27 | 3.3 |
| 90.83333333333334 | 0.78 | 3.31 | 0.24 | 3.46 |
| 90.99794238683127 | 0.77 | 3.48 | 0.21 | 3.62 |
| 91.16255144032922 | 0.76 | 3.64 | 0.18 | 3.77 |
| 91.33744855967079 | 0.76 | 3.8 | 0.15 | 3.93 |
| 91.50205761316873 | 0.76 | 3.96 | 0.12 | 4.08 |
| 91.66666666666666 | 0.76 | 4.12 | 0.09 | 4.23 |
| 91.8312757201646 | 0.77 | 4.28 | 0.05 | 4.39 |
| 91.99588477366255 | 0.78 | 4.43 | 0.02 | 4.53 |
| 92.17078189300412 | 0.79 | 4.55 | -0.02 | 4.65 |
| 92.33539094650206 | 0.81 | 4.68 | -0.05 | 4.78 |
| 92.5 | 0.83 | 4.81 | -0.09 | 4.91 |
| 92.66460905349794 | 0.85 | 4.93 | -0.12 | 5.03 |
| 92.8292181069959 | 0.86 | 5.04 | -0.16 | 5.15 |
| 93.00411522633746 | 0.89 | 5.13 | -0.2 | 5.25 |
| 93.1687242798354 | 0.9 | 5.21 | -0.25 | 5.33 |
| 93.33333333333333 | 0.93 | 5.26 | -0.3 | 5.39 |
| 93.49794238683128 | 0.95 | 5.29 | -0.36 | 5.43 |
| 93.66255144032921 | 0.98 | 5.28 | -0.41 | 5.43 |
| 93.83744855967079 | 1.02 | 5.25 | -0.47 | 5.41 |
| 94.00205761316872 | 1.05 | 5.19 | -0.53 | 5.38 |
| 94.16666666666667 | 1.07 | 5.12 | -0.59 | 5.32 |
| 94.33127572016461 | 1.06 | 5.05 | -0.66 | 5.27 |
| 94.49588477366255 | 1.08 | 5.01 | -0.73 | 5.26 |
| 94.67078189300412 | 1.12 | 4.96 | -0.8 | 5.24 |
| 94.83539094650206 | 1.16 | 4.87 | -0.87 | 5.17 |
| 95.0 | 1.23 | 4.77 | -0.94 | 5.11 |
| 95.16460905349794 | 1.28 | 4.61 | -1.01 | 4.99 |
| 95.32921810699588 | 1.33 | 4.44 | -1.08 | 4.85 |
| 95.50411522633745 | 1.37 | 4.25 | -1.14 | 4.71 |
| 95.66872427983539 | 1.4 | 4.03 | -1.21 | 4.54 |
| 95.83333333333334 | 1.39 | 3.91 | -1.28 | 4.45 |
| 95.99794238683128 | 1.38 | 3.75 | -1.34 | 4.32 |
| 96.16255144032922 | 1.37 | 3.62 | -1.39 | 4.21 |
| 96.33744855967079 | 1.36 | 3.52 | -1.44 | 4.13 |
| 96.50205761316873 | 1.35 | 3.47 | -1.48 | 4.1 |
| 96.66666666666666 | 1.33 | 3.44 | -1.49 | 4.07 |
| 96.83127572016461 | 1.3 | 3.4 | -1.5 | 4.04 |
| 96.99588477366255 | 1.27 | 3.37 | -1.5 | 4.01 |
| 97.17078189300412 | 1.26 | 3.36 | -1.5 | 3.99 |
| 97.33539094650206 | 1.28 | 3.37 | -1.49 | 4 |
| 97.5 | 1.31 | 3.39 | -1.48 | 4.03 |
| 97.66460905349795 | 1.36 | 3.37 | -1.48 | 4.03 |
| 97.8292181069959 | 1.41 | 3.4 | -1.49 | 4.07 |
| 98.00411522633746 | 1.46 | 3.48 | -1.48 | 4.14 |
| 98.1687242798354 | 1.54 | 3.52 | -1.47 | 4.2 |
| 98.33333333333333 | 1.63 | 3.58 | -1.44 | 4.27 |
| 98.49794238683128 | 1.73 | 3.64 | -1.41 | 4.35 |
| 98.66255144032921 | 1.82 | 3.69 | -1.39 | 4.42 |
| 98.83744855967078 | 1.95 | 3.75 | -1.35 | 4.51 |
| 99.00205761316873 | 2.07 | 3.8 | -1.3 | 4.59 |
| 99.16666666666667 | 2.18 | 3.86 | -1.26 | 4.69 |
| 99.33127572016461 | 2.29 | 3.91 | -1.22 | 4.78 |
| 99.49588477366255 | 2.4 | 3.97 | -1.17 | 4.88 |
| 99.67078189300412 | 2.53 | 4.04 | -1.12 | 5 |
| 99.83539094650207 | 2.65 | 4.11 | -1.07 | 5.11 |
| 100.0 | 2.78 | 4.16 | -1.02 | 5.22 |